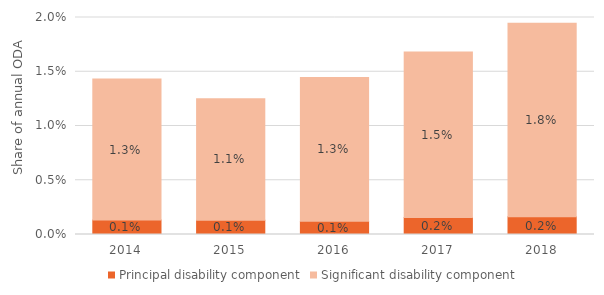
| Category | Principal disability component | Significant disability component |
|---|---|---|
| 2014.0 | 0.001 | 0.013 |
| 2015.0 | 0.001 | 0.011 |
| 2016.0 | 0.001 | 0.013 |
| 2017.0 | 0.002 | 0.015 |
| 2018.0 | 0.002 | 0.018 |